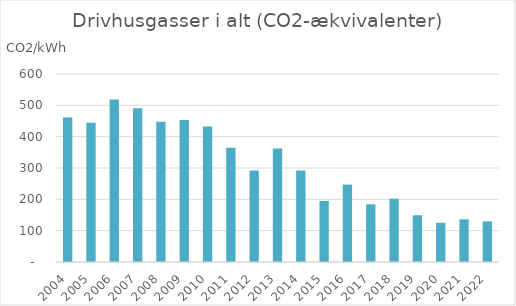
| Category | Drivhusgasser i alt (CO2-ækvivalenter) |
|---|---|
| 2004.0 | 460.923 |
| 2005.0 | 444.381 |
| 2006.0 | 518.732 |
| 2007.0 | 490.629 |
| 2008.0 | 447.566 |
| 2009.0 | 453.117 |
| 2010.0 | 432.486 |
| 2011.0 | 364.726 |
| 2012.0 | 292.249 |
| 2013.0 | 362.501 |
| 2014.0 | 292.382 |
| 2015.0 | 194.875 |
| 2016.0 | 247.137 |
| 2017.0 | 184.106 |
| 2018.0 | 201.786 |
| 2019.0 | 149.146 |
| 2020.0 | 125.239 |
| 2021.0 | 136.398 |
| 2022.0 | 129.696 |